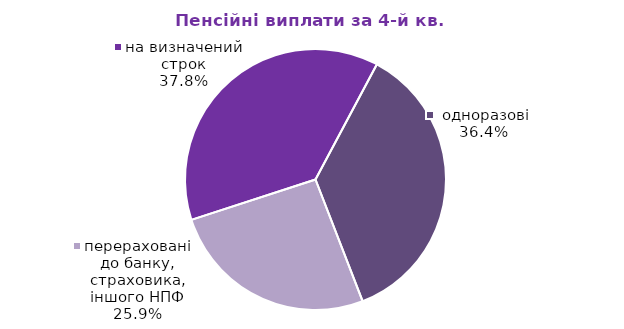
| Category | Series 0 |
|---|---|
| на визначений строк | 21.349 |
|  одноразові | 20.521 |
| перераховані до банку, страховика, іншого НПФ | 14.619 |